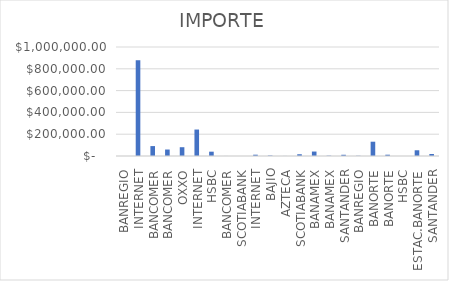
| Category | IMPORTE |
|---|---|
| BANREGIO | 282.91 |
| INTERNET | 878540.84 |
| BANCOMER | 90988.7 |
| BANCOMER | 59364.59 |
| OXXO | 80626.22 |
| INTERNET | 242748.76 |
| HSBC | 39662.61 |
| BANCOMER | 376 |
| SCOTIABANK | 74.6 |
| INTERNET | 11961.19 |
| BAJIO | 4352.36 |
| AZTECA | 534.55 |
| SCOTIABANK | 15980.72 |
| BANAMEX | 40849.06 |
| BANAMEX | 2983.75 |
| SANTANDER | 11325.99 |
| BANREGIO | 2123.53 |
| BANORTE | 131095.46 |
| BANORTE | 11920.84 |
| HSBC | 242.13 |
| ESTAC.BANORTE | 52617.5 |
| SANTANDER | 18402.32 |